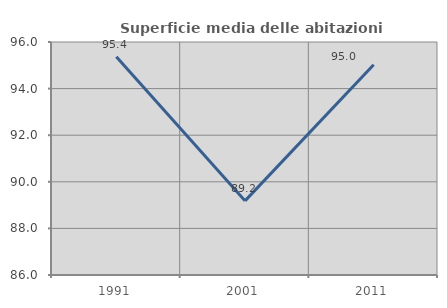
| Category | Superficie media delle abitazioni occupate |
|---|---|
| 1991.0 | 95.365 |
| 2001.0 | 89.182 |
| 2011.0 | 95.026 |